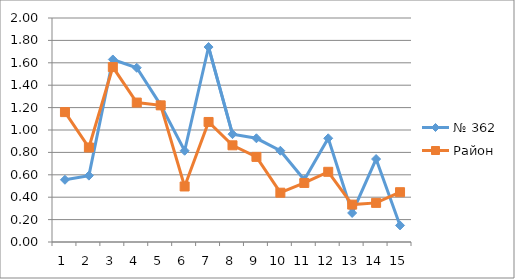
| Category | № 362 | Район |
|---|---|---|
| 0 | 0.556 | 1.16 |
| 1 | 0.593 | 0.844 |
| 2 | 1.63 | 1.562 |
| 3 | 1.556 | 1.245 |
| 4 | 1.222 | 1.22 |
| 5 | 0.815 | 0.496 |
| 6 | 1.741 | 1.072 |
| 7 | 0.963 | 0.863 |
| 8 | 0.926 | 0.76 |
| 9 | 0.815 | 0.44 |
| 10 | 0.556 | 0.527 |
| 11 | 0.926 | 0.627 |
| 12 | 0.259 | 0.334 |
| 13 | 0.741 | 0.349 |
| 14 | 0.148 | 0.445 |